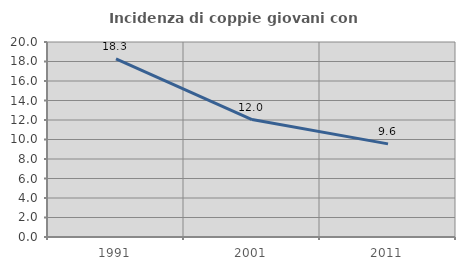
| Category | Incidenza di coppie giovani con figli |
|---|---|
| 1991.0 | 18.27 |
| 2001.0 | 12.05 |
| 2011.0 | 9.553 |